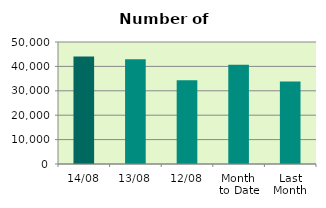
| Category | Series 0 |
|---|---|
| 14/08 | 44092 |
| 13/08 | 42890 |
| 12/08 | 34352 |
| Month 
to Date | 40646 |
| Last
Month | 33803.652 |